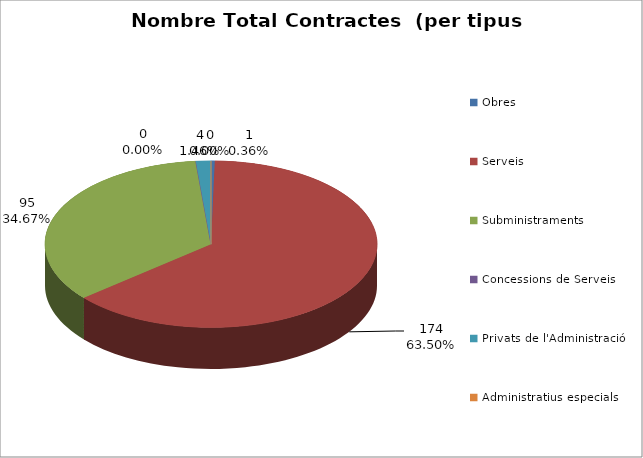
| Category | Nombre Total Contractes |
|---|---|
| Obres | 1 |
| Serveis | 174 |
| Subministraments | 95 |
| Concessions de Serveis | 0 |
| Privats de l'Administració | 4 |
| Administratius especials | 0 |